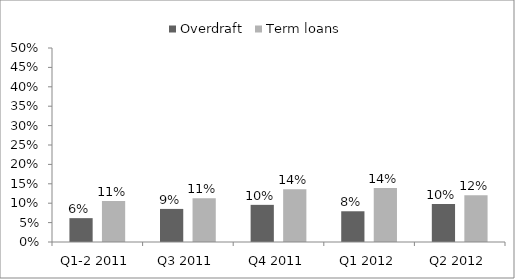
| Category | Overdraft | Term loans |
|---|---|---|
| Q1-2 2011 | 0.061 | 0.106 |
| Q3 2011 | 0.085 | 0.113 |
| Q4 2011 | 0.096 | 0.136 |
| Q1 2012 | 0.079 | 0.139 |
| Q2 2012 | 0.098 | 0.12 |